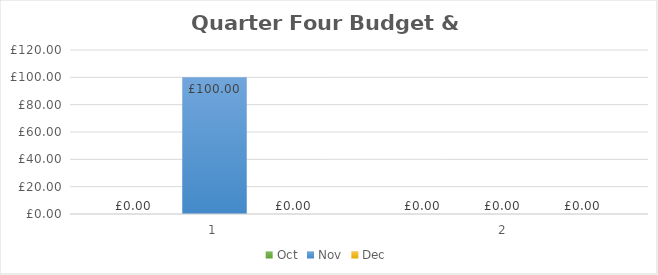
| Category | Oct | Nov | Dec |
|---|---|---|---|
| 0 | 0 | 100 | 0 |
| 1 | 0 | 0 | 0 |